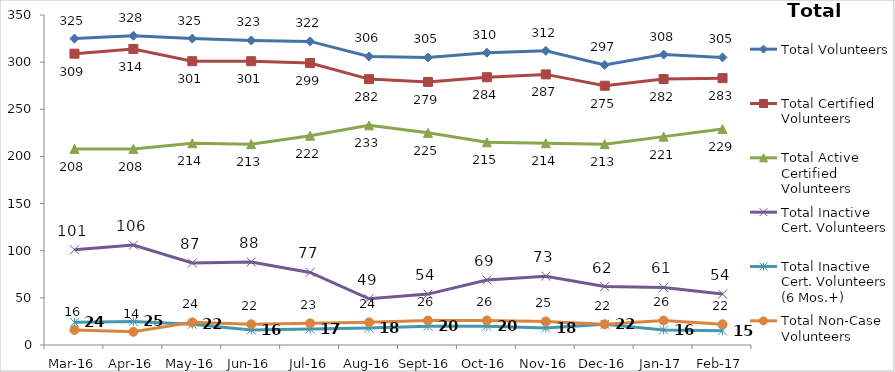
| Category | Total Volunteers | Total Certified Volunteers | Total Active Certified Volunteers | Total Inactive Cert. Volunteers | Total Inactive Cert. Volunteers (6 Mos.+) | Total Non-Case Volunteers |
|---|---|---|---|---|---|---|
| Mar-16 | 325 | 309 | 208 | 101 | 24 | 16 |
| Apr-16 | 328 | 314 | 208 | 106 | 25 | 14 |
| May-16 | 325 | 301 | 214 | 87 | 22 | 24 |
| Jun-16 | 323 | 301 | 213 | 88 | 16 | 22 |
| Jul-16 | 322 | 299 | 222 | 77 | 17 | 23 |
| Aug-16 | 306 | 282 | 233 | 49 | 18 | 24 |
| Sep-16 | 305 | 279 | 225 | 54 | 20 | 26 |
| Oct-16 | 310 | 284 | 215 | 69 | 20 | 26 |
| Nov-16 | 312 | 287 | 214 | 73 | 18 | 25 |
| Dec-16 | 297 | 275 | 213 | 62 | 22 | 22 |
| Jan-17 | 308 | 282 | 221 | 61 | 16 | 26 |
| Feb-17 | 305 | 283 | 229 | 54 | 15 | 22 |